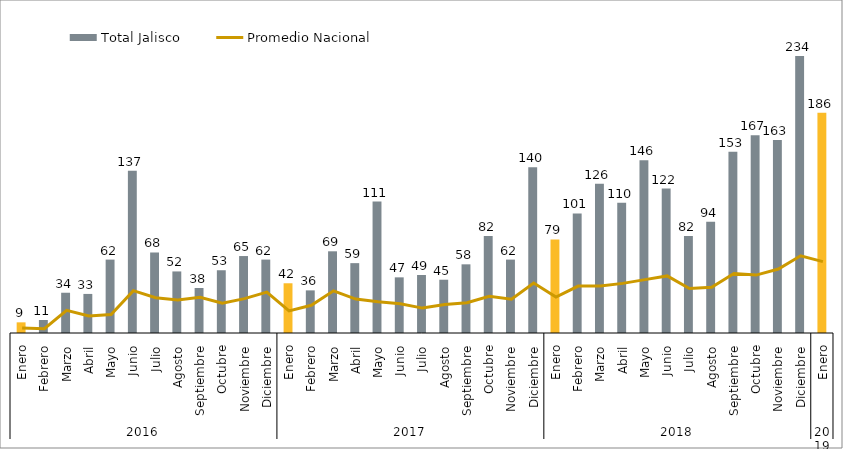
| Category | Total Jalisco |
|---|---|
| 0 | 9 |
| 1 | 11 |
| 2 | 34 |
| 3 | 33 |
| 4 | 62 |
| 5 | 137 |
| 6 | 68 |
| 7 | 52 |
| 8 | 38 |
| 9 | 53 |
| 10 | 65 |
| 11 | 62 |
| 12 | 42 |
| 13 | 36 |
| 14 | 69 |
| 15 | 59 |
| 16 | 111 |
| 17 | 47 |
| 18 | 49 |
| 19 | 45 |
| 20 | 58 |
| 21 | 82 |
| 22 | 62 |
| 23 | 140 |
| 24 | 79 |
| 25 | 101 |
| 26 | 126 |
| 27 | 110 |
| 28 | 146 |
| 29 | 122 |
| 30 | 82 |
| 31 | 94 |
| 32 | 153 |
| 33 | 167 |
| 34 | 163 |
| 35 | 234 |
| 36 | 186 |